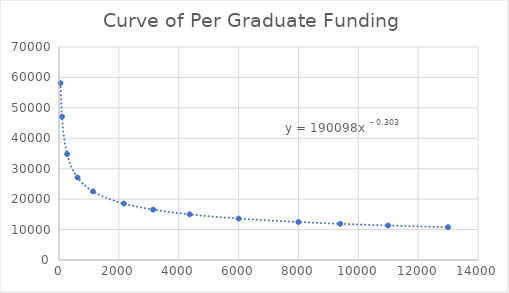
| Category | Series 0 |
|---|---|
| 50.0 | 58098.826 |
| 100.0 | 47092.457 |
| 271.0 | 34814.167 |
| 618.0 | 27118.867 |
| 1136.0 | 22550.593 |
| 2167.0 | 18542.517 |
| 3145.0 | 16563.526 |
| 4365.0 | 14997.358 |
| 6000.0 | 13619.098 |
| 8000.0 | 12482.176 |
| 9394.0 | 11889.181 |
| 11000.0 | 11333.989 |
| 13000.0 | 10774.546 |